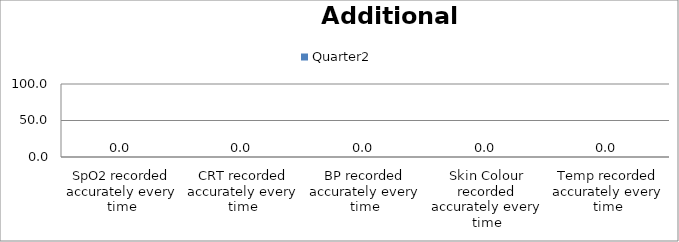
| Category | Quarter2 |
|---|---|
| SpO2 recorded accurately every time | 0 |
| CRT recorded accurately every time | 0 |
| BP recorded accurately every time | 0 |
| Skin Colour recorded accurately every time | 0 |
| Temp recorded accurately every time | 0 |